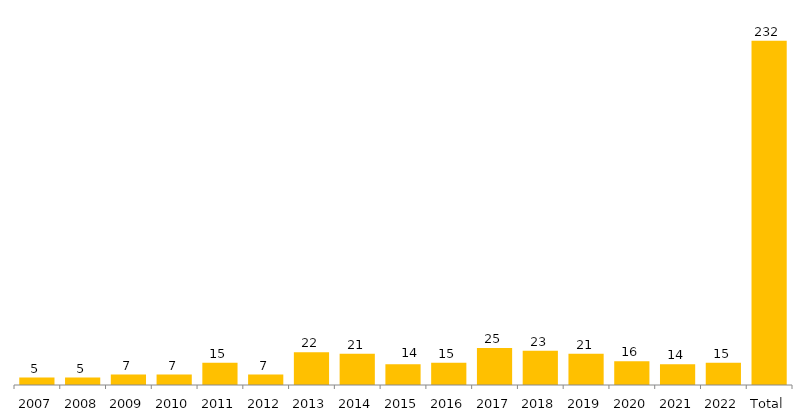
| Category | Total Geral |
|---|---|
| 2007 | 5 |
| 2008 | 5 |
| 2009 | 7 |
| 2010 | 7 |
| 2011 | 15 |
| 2012 | 7 |
| 2013 | 22 |
| 2014 | 21 |
| 2015 | 14 |
| 2016 | 15 |
| 2017 | 25 |
| 2018 | 23 |
| 2019 | 21 |
| 2020 | 16 |
| 2021 | 14 |
| 2022 | 15 |
| Total | 232 |